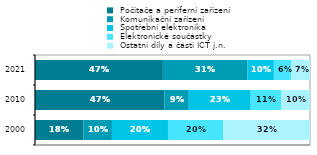
| Category |  Počítače a periferní zařízení |  Komunikační zařízení |  Spotřební elektronika |  Elektronické součástky |  Ostatní díly a části ICT j.n. |
|---|---|---|---|---|---|
| 2000 | 0.176 | 0.103 | 0.204 | 0.201 | 0.316 |
|  2010 | 0.47 | 0.089 | 0.225 | 0.111 | 0.105 |
| 2021 | 0.465 | 0.307 | 0.096 | 0.062 | 0.069 |